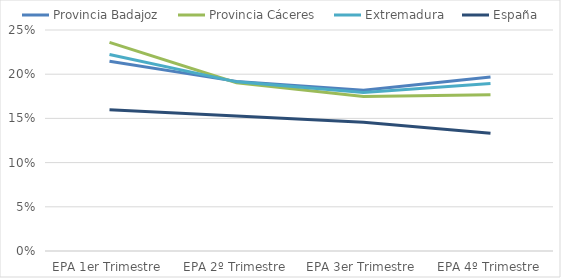
| Category | Provincia Badajoz | Provincia Cáceres | Extremadura | España |
|---|---|---|---|---|
| EPA 1er Trimestre | 0.215 | 0.236 | 0.222 | 0.16 |
| EPA 2º Trimestre | 0.192 | 0.19 | 0.191 | 0.153 |
| EPA 3er Trimestre | 0.182 | 0.175 | 0.179 | 0.146 |
| EPA 4º Trimestre | 0.197 | 0.177 | 0.189 | 0.133 |